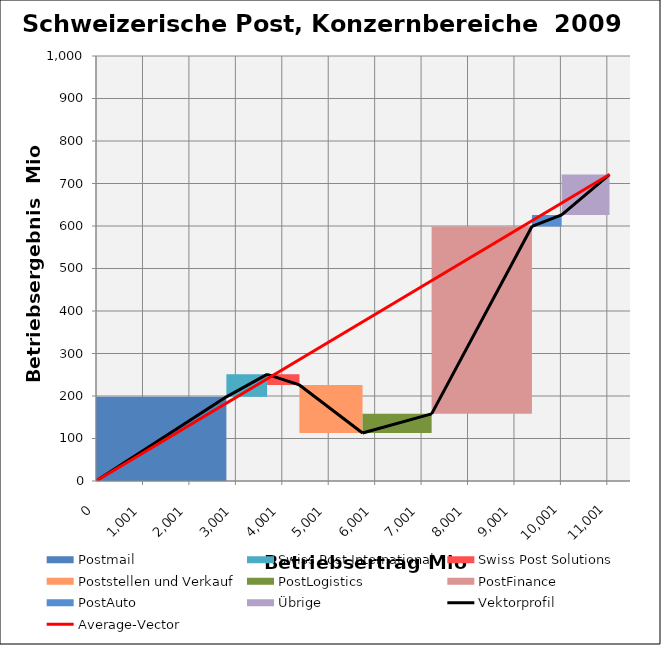
| Category | transparent | Postmail | Swiss Post International | Swiss Post Solutions | Poststellen und Verkauf | PostLogistics | PostFinance | PostAuto | Übrige | Border right & top |
|---|---|---|---|---|---|---|---|---|---|---|
| 0.0 | 0 | 198 | 0 | 0 | 0 | 0 | 0 | 0 | 0 | 0 |
| 2808.0 | 0 | 198 | 0 | 0 | 0 | 0 | 0 | 0 | 0 | 0 |
| 2808.0 | 198 | 0 | 53 | 0 | 0 | 0 | 0 | 0 | 0 | 0 |
| 3685.0 | 198 | 0 | 53 | 0 | 0 | 0 | 0 | 0 | 0 | 0 |
| 3685.0 | 251 | 0 | 0 | -25 | 0 | 0 | 0 | 0 | 0 | 0 |
| 4381.0 | 251 | 0 | 0 | -25 | 0 | 0 | 0 | 0 | 0 | 0 |
| 4381.0 | 226 | 0 | 0 | 0 | -113 | 0 | 0 | 0 | 0 | 0 |
| 5740.0 | 226 | 0 | 0 | 0 | -113 | 0 | 0 | 0 | 0 | 0 |
| 5740.0 | 113 | 0 | 0 | 0 | 0 | 45 | 0 | 0 | 0 | 0 |
| 7228.0 | 113 | 0 | 0 | 0 | 0 | 45 | 0 | 0 | 0 | 0 |
| 7228.0 | 158 | 0 | 0 | 0 | 0 | 0 | 441 | 0 | 0 | 0 |
| 9388.0 | 158 | 0 | 0 | 0 | 0 | 0 | 441 | 0 | 0 | 0 |
| 9388.0 | 599 | 0 | 0 | 0 | 0 | 0 | 0 | 27 | 0 | 0 |
| 10028.0 | 599 | 0 | 0 | 0 | 0 | 0 | 0 | 27 | 0 | 0 |
| 10028.0 | 626 | 0 | 0 | 0 | 0 | 0 | 0 | 0 | 95 | 0 |
| 11058.0 | 626 | 0 | 0 | 0 | 0 | 0 | 0 | 0 | 95 | 0 |
| 11058.0 | 721 | 0 | 0 | 0 | 0 | 0 | 0 | 0 | 0 | 0 |
| 11058.0 | 721 | 0 | 0 | 0 | 0 | 0 | 0 | 0 | 0 | 0 |
| 11058.0 | 721 | 0 | 0 | 0 | 0 | 0 | 0 | 0 | 0 | 0 |
| 11058.0 | 721 | 0 | 0 | 0 | 0 | 0 | 0 | 0 | 0 | 0 |
| 11058.0 | 721 | 0 | 0 | 0 | 0 | 0 | 0 | 0 | 0 | 150 |
| 11500.0 | 721 | 0 | 0 | 0 | 0 | 0 | 0 | 0 | 0 | 150 |
| 11500.0 | 721 | 0 | 0 | 0 | 0 | 0 | 0 | 0 | 0 | 150 |